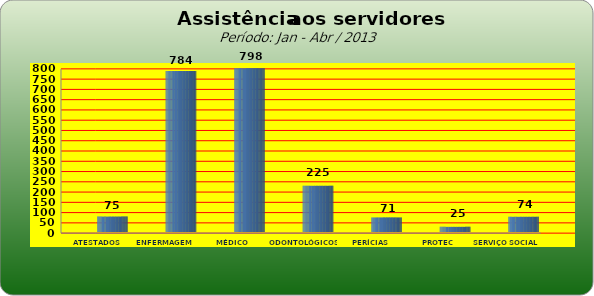
| Category | Series 0 |
|---|---|
| ATESTADOS MÉDICOS | 75 |
| ENFERMAGEM | 784 |
| MÉDICO | 798 |
| ODONTOLÓGICOS | 225 |
| PERÍCIAS MÉDICAS | 71 |
| PROTEC | 25 |
| SERVIÇO SOCIAL | 74 |